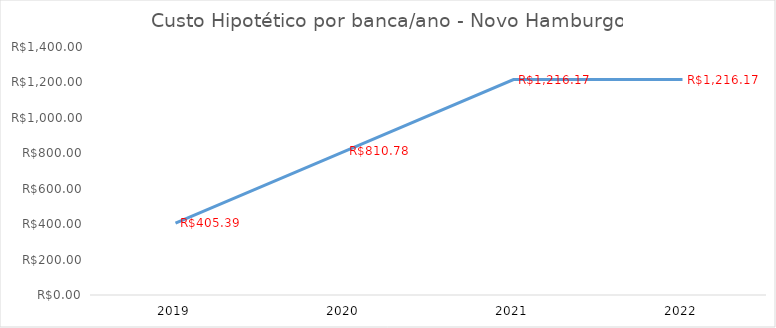
| Category | Series 0 |
|---|---|
| 2019.0 | 405.39 |
| 2020.0 | 810.78 |
| 2021.0 | 1216.17 |
| 2022.0 | 1216.17 |